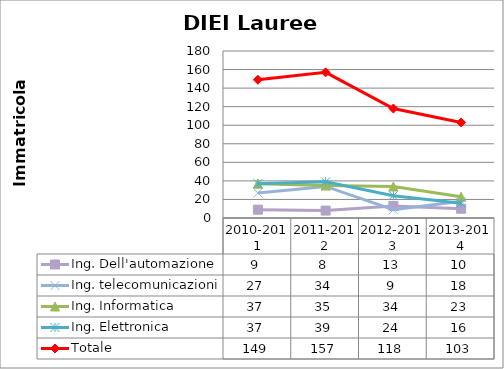
| Category | Ing. Dell'automazione | Ing. telecomunicazioni | Ing. Informatica | Ing. Elettronica | Totale |
|---|---|---|---|---|---|
| 2010-2011 | 9 | 27 | 37 | 37 | 149 |
| 2011-2012 | 8 | 34 | 35 | 39 | 157 |
| 2012-2013 | 13 | 9 | 34 | 24 | 118 |
| 2013-2014 | 10 | 18 | 23 | 16 | 103 |